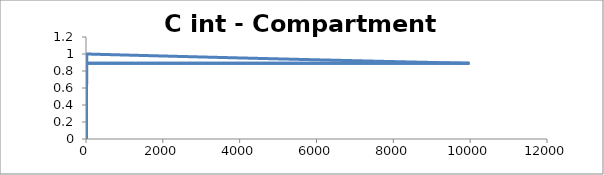
| Category | C - Sys 1 |
|---|---|
| 10.0 | 0 |
| 20.0 | 1 |
| 30.0 | 1 |
| 40.0 | 1 |
| 50.0 | 1 |
| 60.0 | 0.999 |
| 70.0 | 0.999 |
| 80.0 | 0.999 |
| 90.00000000000001 | 0.999 |
| 100.0 | 0.999 |
| 110.0 | 0.999 |
| 120.0 | 0.999 |
| 130.0 | 0.999 |
| 140.0 | 0.998 |
| 150.0 | 0.998 |
| 160.0 | 0.998 |
| 170.0 | 0.998 |
| 180.00000000000003 | 0.998 |
| 190.0 | 0.998 |
| 200.0 | 0.998 |
| 210.0 | 0.998 |
| 220.0 | 0.997 |
| 230.0 | 0.997 |
| 240.0 | 0.997 |
| 250.0 | 0.997 |
| 260.0 | 0.997 |
| 270.0 | 0.997 |
| 280.0 | 0.997 |
| 290.0 | 0.997 |
| 300.0 | 0.997 |
| 310.0 | 0.996 |
| 320.0 | 0.996 |
| 330.0 | 0.996 |
| 340.0 | 0.996 |
| 350.00000000000006 | 0.996 |
| 360.00000000000006 | 0.996 |
| 370.0 | 0.996 |
| 380.0 | 0.996 |
| 390.0 | 0.995 |
| 400.0 | 0.995 |
| 410.0 | 0.995 |
| 420.0 | 0.995 |
| 430.00000000000006 | 0.995 |
| 440.0 | 0.995 |
| 450.0 | 0.995 |
| 460.0 | 0.995 |
| 470.0 | 0.995 |
| 480.0 | 0.994 |
| 490.0 | 0.994 |
| 500.0 | 0.994 |
| 510.00000000000006 | 0.994 |
| 520.0 | 0.994 |
| 530.0 | 0.994 |
| 540.0 | 0.994 |
| 550.0 | 0.994 |
| 560.0 | 0.993 |
| 570.0 | 0.993 |
| 580.0 | 0.993 |
| 590.0 | 0.993 |
| 600.0 | 0.993 |
| 610.0 | 0.993 |
| 620.0 | 0.993 |
| 630.0 | 0.993 |
| 640.0 | 0.992 |
| 650.0 | 0.992 |
| 660.0 | 0.992 |
| 670.0 | 0.992 |
| 680.0 | 0.992 |
| 690.0000000000001 | 0.992 |
| 700.0000000000001 | 0.992 |
| 710.0000000000001 | 0.992 |
| 720.0000000000001 | 0.992 |
| 730.0 | 0.991 |
| 740.0 | 0.991 |
| 750.0 | 0.991 |
| 760.0 | 0.991 |
| 770.0 | 0.991 |
| 780.0 | 0.991 |
| 790.0 | 0.991 |
| 800.0 | 0.991 |
| 810.0 | 0.99 |
| 820.0 | 0.99 |
| 830.0 | 0.99 |
| 840.0 | 0.99 |
| 850.0000000000001 | 0.99 |
| 860.0000000000001 | 0.99 |
| 870.0000000000001 | 0.99 |
| 880.0 | 0.99 |
| 890.0 | 0.99 |
| 900.0 | 0.989 |
| 910.0 | 0.989 |
| 920.0 | 0.989 |
| 930.0 | 0.989 |
| 940.0 | 0.989 |
| 950.0 | 0.989 |
| 960.0 | 0.989 |
| 970.0 | 0.989 |
| 980.0 | 0.988 |
| 990.0 | 0.988 |
| 1000.0 | 0.988 |
| 1010.0000000000001 | 0.988 |
| 1020.0000000000001 | 0.988 |
| 1030.0 | 0.988 |
| 1040.0 | 0.988 |
| 1050.0 | 0.988 |
| 1060.0 | 0.988 |
| 1070.0 | 0.987 |
| 1080.0 | 0.987 |
| 1090.0 | 0.987 |
| 1100.0 | 0.987 |
| 1110.0 | 0.987 |
| 1120.0 | 0.987 |
| 1130.0 | 0.987 |
| 1140.0 | 0.987 |
| 1150.0 | 0.986 |
| 1160.0 | 0.986 |
| 1170.0 | 0.986 |
| 1180.0 | 0.986 |
| 1190.0 | 0.986 |
| 1200.0 | 0.986 |
| 1210.0 | 0.986 |
| 1220.0 | 0.986 |
| 1230.0 | 0.986 |
| 1240.0 | 0.985 |
| 1250.0 | 0.985 |
| 1260.0 | 0.985 |
| 1270.0 | 0.985 |
| 1280.0 | 0.985 |
| 1290.0 | 0.985 |
| 1300.0 | 0.985 |
| 1310.0 | 0.985 |
| 1320.0 | 0.984 |
| 1330.0 | 0.984 |
| 1340.0 | 0.984 |
| 1350.0 | 0.984 |
| 1360.0 | 0.984 |
| 1370.0 | 0.984 |
| 1380.0000000000002 | 0.984 |
| 1390.0000000000002 | 0.984 |
| 1400.0000000000002 | 0.984 |
| 1410.0000000000002 | 0.983 |
| 1420.0000000000002 | 0.983 |
| 1430.0000000000002 | 0.983 |
| 1440.0000000000002 | 0.983 |
| 1450.0 | 0.983 |
| 1460.0 | 0.983 |
| 1470.0 | 0.983 |
| 1480.0 | 0.983 |
| 1490.0 | 0.982 |
| 1500.0 | 0.982 |
| 1510.0 | 0.982 |
| 1520.0 | 0.982 |
| 1530.0 | 0.982 |
| 1540.0 | 0.982 |
| 1550.0 | 0.982 |
| 1560.0 | 0.982 |
| 1570.0 | 0.982 |
| 1580.0 | 0.981 |
| 1590.0 | 0.981 |
| 1600.0 | 0.981 |
| 1610.0 | 0.981 |
| 1620.0 | 0.981 |
| 1630.0 | 0.981 |
| 1640.0 | 0.981 |
| 1650.0 | 0.981 |
| 1660.0 | 0.98 |
| 1670.0 | 0.98 |
| 1680.0 | 0.98 |
| 1690.0 | 0.98 |
| 1700.0000000000002 | 0.98 |
| 1710.0000000000002 | 0.98 |
| 1720.0000000000002 | 0.98 |
| 1730.0000000000002 | 0.98 |
| 1740.0000000000002 | 0.98 |
| 1750.0000000000002 | 0.979 |
| 1760.0 | 0.979 |
| 1770.0 | 0.979 |
| 1780.0 | 0.979 |
| 1790.0 | 0.979 |
| 1800.0 | 0.979 |
| 1810.0 | 0.979 |
| 1820.0 | 0.979 |
| 1830.0 | 0.979 |
| 1840.0 | 0.978 |
| 1850.0 | 0.978 |
| 1860.0 | 0.978 |
| 1870.0 | 0.978 |
| 1880.0 | 0.978 |
| 1890.0 | 0.978 |
| 1900.0 | 0.978 |
| 1910.0 | 0.978 |
| 1920.0 | 0.977 |
| 1930.0 | 0.977 |
| 1940.0 | 0.977 |
| 1950.0 | 0.977 |
| 1960.0 | 0.977 |
| 1970.0 | 0.977 |
| 1980.0 | 0.977 |
| 1990.0 | 0.977 |
| 2000.0 | 0.977 |
| 2010.0000000000002 | 0.976 |
| 2020.0000000000002 | 0.976 |
| 2030.0000000000002 | 0.976 |
| 2040.0000000000002 | 0.976 |
| 2050.0 | 0.976 |
| 2060.0 | 0.976 |
| 2070.0 | 0.976 |
| 2080.0 | 0.976 |
| 2090.0 | 0.976 |
| 2100.0 | 0.975 |
| 2110.0 | 0.975 |
| 2120.0 | 0.975 |
| 2130.0 | 0.975 |
| 2140.0 | 0.975 |
| 2150.0 | 0.975 |
| 2160.0 | 0.975 |
| 2170.0 | 0.975 |
| 2180.0 | 0.974 |
| 2190.0 | 0.974 |
| 2200.0 | 0.974 |
| 2210.0 | 0.974 |
| 2220.0 | 0.974 |
| 2230.0 | 0.974 |
| 2240.0 | 0.974 |
| 2250.0 | 0.974 |
| 2260.0 | 0.974 |
| 2270.0 | 0.973 |
| 2280.0 | 0.973 |
| 2290.0 | 0.973 |
| 2300.0 | 0.973 |
| 2310.0 | 0.973 |
| 2320.0 | 0.973 |
| 2330.0 | 0.973 |
| 2340.0 | 0.973 |
| 2350.0 | 0.973 |
| 2360.0 | 0.972 |
| 2370.0 | 0.972 |
| 2380.0 | 0.972 |
| 2390.0 | 0.972 |
| 2400.0 | 0.972 |
| 2410.0 | 0.972 |
| 2420.0 | 0.972 |
| 2430.0 | 0.972 |
| 2440.0 | 0.971 |
| 2450.0 | 0.971 |
| 2460.0 | 0.971 |
| 2470.0 | 0.971 |
| 2480.0 | 0.971 |
| 2490.0 | 0.971 |
| 2500.0 | 0.971 |
| 2510.0 | 0.971 |
| 2520.0 | 0.971 |
| 2530.0 | 0.97 |
| 2540.0 | 0.97 |
| 2550.0 | 0.97 |
| 2560.0 | 0.97 |
| 2570.0 | 0.97 |
| 2580.0 | 0.97 |
| 2590.0 | 0.97 |
| 2600.0 | 0.97 |
| 2610.0 | 0.97 |
| 2620.0 | 0.969 |
| 2630.0 | 0.969 |
| 2640.0 | 0.969 |
| 2650.0 | 0.969 |
| 2660.0 | 0.969 |
| 2670.0 | 0.969 |
| 2680.0 | 0.969 |
| 2690.0 | 0.969 |
| 2700.0 | 0.968 |
| 2710.0 | 0.968 |
| 2720.0 | 0.968 |
| 2730.0 | 0.968 |
| 2740.0 | 0.968 |
| 2750.0 | 0.968 |
| 2760.0000000000005 | 0.968 |
| 2770.0000000000005 | 0.968 |
| 2780.0000000000005 | 0.968 |
| 2790.0000000000005 | 0.967 |
| 2800.0000000000005 | 0.967 |
| 2810.0000000000005 | 0.967 |
| 2820.0000000000005 | 0.967 |
| 2830.0000000000005 | 0.967 |
| 2840.0000000000005 | 0.967 |
| 2850.0000000000005 | 0.967 |
| 2860.0000000000005 | 0.967 |
| 2870.0000000000005 | 0.967 |
| 2880.0000000000005 | 0.966 |
| 2890.0 | 0.966 |
| 2900.0 | 0.966 |
| 2910.0 | 0.966 |
| 2920.0 | 0.966 |
| 2930.0 | 0.966 |
| 2940.0 | 0.966 |
| 2950.0 | 0.966 |
| 2960.0 | 0.966 |
| 2970.0 | 0.965 |
| 2980.0 | 0.965 |
| 2990.0 | 0.965 |
| 3000.0 | 0.965 |
| 3010.0 | 0.965 |
| 3020.0 | 0.965 |
| 3030.0 | 0.965 |
| 3040.0 | 0.965 |
| 3050.0 | 0.965 |
| 3060.0 | 0.964 |
| 3070.0 | 0.964 |
| 3080.0 | 0.964 |
| 3090.0 | 0.964 |
| 3100.0 | 0.964 |
| 3110.0 | 0.964 |
| 3120.0 | 0.964 |
| 3130.0 | 0.964 |
| 3140.0 | 0.963 |
| 3150.0 | 0.963 |
| 3160.0 | 0.963 |
| 3170.0 | 0.963 |
| 3180.0 | 0.963 |
| 3190.0 | 0.963 |
| 3200.0 | 0.963 |
| 3210.0 | 0.963 |
| 3220.0 | 0.963 |
| 3230.0 | 0.962 |
| 3240.0 | 0.962 |
| 3250.0 | 0.962 |
| 3260.0 | 0.962 |
| 3270.0 | 0.962 |
| 3280.0 | 0.962 |
| 3290.0 | 0.962 |
| 3300.0 | 0.962 |
| 3310.0 | 0.962 |
| 3320.0 | 0.961 |
| 3330.0 | 0.961 |
| 3340.0 | 0.961 |
| 3350.0 | 0.961 |
| 3360.0 | 0.961 |
| 3370.0 | 0.961 |
| 3380.0 | 0.961 |
| 3390.0000000000005 | 0.961 |
| 3400.0000000000005 | 0.961 |
| 3410.0000000000005 | 0.96 |
| 3420.0000000000005 | 0.96 |
| 3430.0000000000005 | 0.96 |
| 3440.0000000000005 | 0.96 |
| 3450.0000000000005 | 0.96 |
| 3460.0000000000005 | 0.96 |
| 3470.0000000000005 | 0.96 |
| 3480.0000000000005 | 0.96 |
| 3490.0000000000005 | 0.96 |
| 3500.0000000000005 | 0.959 |
| 3510.0000000000005 | 0.959 |
| 3520.0 | 0.959 |
| 3530.0 | 0.959 |
| 3540.0 | 0.959 |
| 3550.0 | 0.959 |
| 3560.0 | 0.959 |
| 3570.0 | 0.959 |
| 3580.0 | 0.959 |
| 3590.0 | 0.958 |
| 3600.0 | 0.958 |
| 3610.0 | 0.958 |
| 3620.0 | 0.958 |
| 3630.0 | 0.958 |
| 3640.0 | 0.958 |
| 3650.0 | 0.958 |
| 3660.0 | 0.958 |
| 3670.0 | 0.957 |
| 3680.0 | 0.957 |
| 3690.0 | 0.957 |
| 3700.0 | 0.957 |
| 3710.0 | 0.957 |
| 3720.0 | 0.957 |
| 3730.0 | 0.957 |
| 3740.0 | 0.957 |
| 3750.0 | 0.957 |
| 3760.0 | 0.956 |
| 3770.0 | 0.956 |
| 3780.0 | 0.956 |
| 3790.0 | 0.956 |
| 3800.0 | 0.956 |
| 3810.0 | 0.956 |
| 3820.0 | 0.956 |
| 3830.0 | 0.956 |
| 3840.0 | 0.956 |
| 3850.0 | 0.955 |
| 3860.0 | 0.955 |
| 3870.0 | 0.955 |
| 3880.0 | 0.955 |
| 3890.0 | 0.955 |
| 3900.0 | 0.955 |
| 3910.0 | 0.955 |
| 3920.0 | 0.955 |
| 3930.0 | 0.955 |
| 3940.0 | 0.954 |
| 3950.0 | 0.954 |
| 3960.0 | 0.954 |
| 3970.0 | 0.954 |
| 3980.0 | 0.954 |
| 3990.0 | 0.954 |
| 4000.0 | 0.954 |
| 4010.0000000000005 | 0.954 |
| 4020.0000000000005 | 0.954 |
| 4030.0000000000005 | 0.953 |
| 4040.0000000000005 | 0.953 |
| 4050.0000000000005 | 0.953 |
| 4060.0000000000005 | 0.953 |
| 4070.0000000000005 | 0.953 |
| 4080.0000000000005 | 0.953 |
| 4090.0000000000005 | 0.953 |
| 4100.0 | 0.953 |
| 4110.0 | 0.953 |
| 4120.0 | 0.952 |
| 4130.0 | 0.952 |
| 4140.0 | 0.952 |
| 4150.0 | 0.952 |
| 4160.0 | 0.952 |
| 4170.0 | 0.952 |
| 4180.0 | 0.952 |
| 4190.0 | 0.952 |
| 4200.0 | 0.952 |
| 4210.0 | 0.951 |
| 4220.0 | 0.951 |
| 4230.0 | 0.951 |
| 4240.0 | 0.951 |
| 4250.0 | 0.951 |
| 4260.0 | 0.951 |
| 4270.0 | 0.951 |
| 4280.0 | 0.951 |
| 4290.0 | 0.951 |
| 4300.0 | 0.95 |
| 4310.0 | 0.95 |
| 4320.0 | 0.95 |
| 4330.0 | 0.95 |
| 4340.0 | 0.95 |
| 4350.0 | 0.95 |
| 4360.0 | 0.95 |
| 4370.0 | 0.95 |
| 4380.0 | 0.95 |
| 4390.0 | 0.949 |
| 4400.0 | 0.949 |
| 4410.0 | 0.949 |
| 4420.0 | 0.949 |
| 4430.0 | 0.949 |
| 4440.0 | 0.949 |
| 4450.0 | 0.949 |
| 4460.0 | 0.949 |
| 4470.0 | 0.949 |
| 4480.0 | 0.948 |
| 4490.0 | 0.948 |
| 4500.0 | 0.948 |
| 4510.0 | 0.948 |
| 4520.0 | 0.948 |
| 4530.0 | 0.948 |
| 4540.0 | 0.948 |
| 4550.0 | 0.948 |
| 4560.0 | 0.948 |
| 4570.0 | 0.947 |
| 4580.0 | 0.947 |
| 4590.0 | 0.947 |
| 4600.0 | 0.947 |
| 4610.0 | 0.947 |
| 4620.0 | 0.947 |
| 4630.0 | 0.947 |
| 4640.0 | 0.947 |
| 4650.0 | 0.947 |
| 4660.0 | 0.946 |
| 4670.0 | 0.946 |
| 4680.0 | 0.946 |
| 4690.0 | 0.946 |
| 4700.0 | 0.946 |
| 4710.0 | 0.946 |
| 4720.0 | 0.946 |
| 4730.0 | 0.946 |
| 4740.0 | 0.946 |
| 4750.0 | 0.945 |
| 4760.0 | 0.945 |
| 4770.0 | 0.945 |
| 4780.0 | 0.945 |
| 4790.0 | 0.945 |
| 4800.0 | 0.945 |
| 4810.0 | 0.945 |
| 4820.0 | 0.945 |
| 4830.0 | 0.945 |
| 4840.0 | 0.944 |
| 4850.0 | 0.944 |
| 4860.0 | 0.944 |
| 4870.0 | 0.944 |
| 4880.0 | 0.944 |
| 4890.0 | 0.944 |
| 4900.0 | 0.944 |
| 4910.0 | 0.944 |
| 4920.0 | 0.944 |
| 4930.0 | 0.943 |
| 4940.0 | 0.943 |
| 4950.0 | 0.943 |
| 4960.0 | 0.943 |
| 4970.0 | 0.943 |
| 4980.0 | 0.943 |
| 4990.0 | 0.943 |
| 5000.0 | 0.943 |
| 5010.0 | 0.943 |
| 5020.0 | 0.943 |
| 5030.0 | 0.942 |
| 5040.0 | 0.942 |
| 5050.0 | 0.942 |
| 5060.0 | 0.942 |
| 5070.0 | 0.942 |
| 5080.0 | 0.942 |
| 5090.0 | 0.942 |
| 5100.0 | 0.942 |
| 5110.0 | 0.942 |
| 5120.0 | 0.941 |
| 5130.0 | 0.941 |
| 5140.0 | 0.941 |
| 5150.0 | 0.941 |
| 5160.0 | 0.941 |
| 5170.0 | 0.941 |
| 5180.0 | 0.941 |
| 5190.0 | 0.941 |
| 5200.0 | 0.941 |
| 5210.0 | 0.94 |
| 5220.0 | 0.94 |
| 5230.0 | 0.94 |
| 5240.0 | 0.94 |
| 5250.0 | 0.94 |
| 5260.0 | 0.94 |
| 5270.0 | 0.94 |
| 5280.0 | 0.94 |
| 5290.0 | 0.94 |
| 5300.0 | 0.939 |
| 5310.0 | 0.939 |
| 5320.0 | 0.939 |
| 5330.0 | 0.939 |
| 5340.0 | 0.939 |
| 5350.0 | 0.939 |
| 5360.0 | 0.939 |
| 5370.0 | 0.939 |
| 5380.0 | 0.939 |
| 5390.0 | 0.938 |
| 5400.0 | 0.938 |
| 5410.0 | 0.938 |
| 5420.0 | 0.938 |
| 5430.0 | 0.938 |
| 5440.0 | 0.938 |
| 5450.0 | 0.938 |
| 5460.0 | 0.938 |
| 5470.0 | 0.938 |
| 5480.0 | 0.937 |
| 5490.0 | 0.937 |
| 5500.0 | 0.937 |
| 5510.0 | 0.937 |
| 5520.000000000001 | 0.937 |
| 5530.000000000001 | 0.937 |
| 5540.000000000001 | 0.937 |
| 5550.000000000001 | 0.937 |
| 5560.000000000001 | 0.937 |
| 5570.000000000001 | 0.937 |
| 5580.000000000001 | 0.936 |
| 5590.000000000001 | 0.936 |
| 5600.000000000001 | 0.936 |
| 5610.000000000001 | 0.936 |
| 5620.000000000001 | 0.936 |
| 5630.000000000001 | 0.936 |
| 5640.000000000001 | 0.936 |
| 5650.000000000001 | 0.936 |
| 5660.000000000001 | 0.936 |
| 5670.000000000001 | 0.935 |
| 5680.000000000001 | 0.935 |
| 5690.000000000001 | 0.935 |
| 5700.000000000001 | 0.935 |
| 5710.000000000001 | 0.935 |
| 5720.000000000001 | 0.935 |
| 5730.000000000001 | 0.935 |
| 5740.000000000001 | 0.935 |
| 5750.000000000001 | 0.935 |
| 5760.000000000001 | 0.934 |
| 5770.0 | 0.934 |
| 5780.0 | 0.934 |
| 5790.0 | 0.934 |
| 5800.0 | 0.934 |
| 5810.0 | 0.934 |
| 5820.0 | 0.934 |
| 5830.0 | 0.934 |
| 5840.0 | 0.934 |
| 5850.0 | 0.933 |
| 5860.0 | 0.933 |
| 5870.0 | 0.933 |
| 5880.0 | 0.933 |
| 5890.0 | 0.933 |
| 5900.0 | 0.933 |
| 5910.0 | 0.933 |
| 5920.0 | 0.933 |
| 5930.0 | 0.933 |
| 5940.0 | 0.933 |
| 5950.0 | 0.932 |
| 5960.0 | 0.932 |
| 5970.0 | 0.932 |
| 5980.0 | 0.932 |
| 5990.0 | 0.932 |
| 6000.0 | 0.932 |
| 6010.0 | 0.932 |
| 6020.0 | 0.932 |
| 6030.0 | 0.932 |
| 6040.0 | 0.931 |
| 6050.0 | 0.931 |
| 6060.0 | 0.931 |
| 6070.0 | 0.931 |
| 6080.0 | 0.931 |
| 6090.0 | 0.931 |
| 6100.0 | 0.931 |
| 6110.0 | 0.931 |
| 6120.0 | 0.931 |
| 6130.0 | 0.93 |
| 6140.0 | 0.93 |
| 6150.0 | 0.93 |
| 6160.0 | 0.93 |
| 6170.0 | 0.93 |
| 6180.0 | 0.93 |
| 6190.0 | 0.93 |
| 6200.0 | 0.93 |
| 6210.0 | 0.93 |
| 6220.0 | 0.929 |
| 6230.0 | 0.929 |
| 6240.0 | 0.929 |
| 6250.0 | 0.929 |
| 6260.0 | 0.929 |
| 6270.0 | 0.929 |
| 6280.0 | 0.929 |
| 6290.0 | 0.929 |
| 6300.0 | 0.929 |
| 6310.0 | 0.929 |
| 6320.0 | 0.928 |
| 6330.0 | 0.928 |
| 6340.0 | 0.928 |
| 6350.0 | 0.928 |
| 6360.0 | 0.928 |
| 6370.0 | 0.928 |
| 6380.0 | 0.928 |
| 6390.0 | 0.928 |
| 6400.0 | 0.928 |
| 6410.0 | 0.927 |
| 6420.0 | 0.927 |
| 6430.0 | 0.927 |
| 6440.0 | 0.927 |
| 6450.0 | 0.927 |
| 6460.0 | 0.927 |
| 6470.0 | 0.927 |
| 6480.0 | 0.927 |
| 6490.0 | 0.927 |
| 6500.0 | 0.926 |
| 6510.0 | 0.926 |
| 6520.0 | 0.926 |
| 6530.0 | 0.926 |
| 6540.0 | 0.926 |
| 6550.0 | 0.926 |
| 6560.0 | 0.926 |
| 6570.0 | 0.926 |
| 6580.0 | 0.926 |
| 6590.0 | 0.926 |
| 6600.0 | 0.925 |
| 6610.0 | 0.925 |
| 6620.0 | 0.925 |
| 6630.0 | 0.925 |
| 6640.0 | 0.925 |
| 6650.0 | 0.925 |
| 6660.0 | 0.925 |
| 6670.0 | 0.925 |
| 6680.0 | 0.925 |
| 6690.0 | 0.924 |
| 6700.0 | 0.924 |
| 6710.0 | 0.924 |
| 6720.0 | 0.924 |
| 6730.0 | 0.924 |
| 6740.0 | 0.924 |
| 6750.0 | 0.924 |
| 6760.0 | 0.924 |
| 6770.000000000001 | 0.924 |
| 6780.000000000001 | 0.924 |
| 6790.000000000001 | 0.923 |
| 6800.000000000001 | 0.923 |
| 6810.000000000001 | 0.923 |
| 6820.000000000001 | 0.923 |
| 6830.000000000001 | 0.923 |
| 6840.000000000001 | 0.923 |
| 6850.000000000001 | 0.923 |
| 6860.000000000001 | 0.923 |
| 6870.000000000001 | 0.923 |
| 6880.000000000001 | 0.922 |
| 6890.000000000001 | 0.922 |
| 6900.000000000001 | 0.922 |
| 6910.000000000001 | 0.922 |
| 6920.000000000001 | 0.922 |
| 6930.000000000001 | 0.922 |
| 6940.000000000001 | 0.922 |
| 6950.000000000001 | 0.922 |
| 6960.000000000001 | 0.922 |
| 6970.000000000001 | 0.921 |
| 6980.000000000001 | 0.921 |
| 6990.000000000001 | 0.921 |
| 7000.000000000001 | 0.921 |
| 7010.000000000001 | 0.921 |
| 7020.000000000001 | 0.921 |
| 7030.000000000001 | 0.921 |
| 7040.0 | 0.921 |
| 7050.0 | 0.921 |
| 7060.0 | 0.921 |
| 7070.0 | 0.92 |
| 7080.0 | 0.92 |
| 7090.0 | 0.92 |
| 7100.0 | 0.92 |
| 7110.0 | 0.92 |
| 7120.0 | 0.92 |
| 7130.0 | 0.92 |
| 7140.0 | 0.92 |
| 7150.0 | 0.92 |
| 7160.0 | 0.919 |
| 7170.0 | 0.919 |
| 7180.0 | 0.919 |
| 7190.0 | 0.919 |
| 7200.0 | 0.919 |
| 7210.0 | 0.919 |
| 7220.0 | 0.919 |
| 7230.0 | 0.919 |
| 7240.0 | 0.919 |
| 7250.0 | 0.919 |
| 7260.0 | 0.918 |
| 7270.0 | 0.918 |
| 7280.0 | 0.918 |
| 7290.0 | 0.918 |
| 7300.0 | 0.918 |
| 7310.0 | 0.918 |
| 7320.0 | 0.918 |
| 7330.0 | 0.918 |
| 7340.0 | 0.918 |
| 7350.0 | 0.917 |
| 7360.0 | 0.917 |
| 7370.0 | 0.917 |
| 7380.0 | 0.917 |
| 7390.0 | 0.917 |
| 7400.0 | 0.917 |
| 7410.0 | 0.917 |
| 7420.0 | 0.917 |
| 7430.0 | 0.917 |
| 7440.0 | 0.917 |
| 7450.0 | 0.916 |
| 7460.0 | 0.916 |
| 7470.0 | 0.916 |
| 7480.0 | 0.916 |
| 7490.0 | 0.916 |
| 7500.0 | 0.916 |
| 7510.0 | 0.916 |
| 7520.0 | 0.916 |
| 7530.0 | 0.916 |
| 7540.0 | 0.915 |
| 7550.0 | 0.915 |
| 7560.0 | 0.915 |
| 7570.0 | 0.915 |
| 7580.0 | 0.915 |
| 7590.0 | 0.915 |
| 7600.0 | 0.915 |
| 7610.0 | 0.915 |
| 7620.0 | 0.915 |
| 7630.0 | 0.915 |
| 7640.0 | 0.914 |
| 7650.0 | 0.914 |
| 7660.0 | 0.914 |
| 7670.0 | 0.914 |
| 7680.0 | 0.914 |
| 7690.0 | 0.914 |
| 7700.0 | 0.914 |
| 7710.0 | 0.914 |
| 7720.0 | 0.914 |
| 7730.0 | 0.914 |
| 7740.0 | 0.913 |
| 7750.0 | 0.913 |
| 7760.0 | 0.913 |
| 7770.0 | 0.913 |
| 7780.0 | 0.913 |
| 7790.0 | 0.913 |
| 7800.0 | 0.913 |
| 7810.0 | 0.913 |
| 7820.0 | 0.913 |
| 7830.0 | 0.912 |
| 7840.0 | 0.912 |
| 7850.0 | 0.912 |
| 7860.0 | 0.912 |
| 7870.0 | 0.912 |
| 7880.0 | 0.912 |
| 7890.0 | 0.912 |
| 7900.0 | 0.912 |
| 7910.0 | 0.912 |
| 7920.0 | 0.912 |
| 7930.0 | 0.911 |
| 7940.0 | 0.911 |
| 7950.0 | 0.911 |
| 7960.0 | 0.911 |
| 7970.0 | 0.911 |
| 7980.0 | 0.911 |
| 7990.0 | 0.911 |
| 8000.0 | 0.911 |
| 8010.0 | 0.911 |
| 8020.000000000001 | 0.91 |
| 8030.000000000001 | 0.91 |
| 8040.000000000001 | 0.91 |
| 8050.000000000001 | 0.91 |
| 8060.000000000001 | 0.91 |
| 8070.000000000001 | 0.91 |
| 8080.000000000001 | 0.91 |
| 8090.000000000001 | 0.91 |
| 8100.000000000001 | 0.91 |
| 8110.000000000001 | 0.91 |
| 8120.000000000001 | 0.909 |
| 8130.000000000001 | 0.909 |
| 8140.000000000001 | 0.909 |
| 8150.000000000001 | 0.909 |
| 8160.000000000001 | 0.909 |
| 8170.000000000001 | 0.909 |
| 8180.000000000001 | 0.909 |
| 8190.000000000001 | 0.909 |
| 8200.0 | 0.909 |
| 8210.0 | 0.909 |
| 8220.0 | 0.908 |
| 8230.0 | 0.908 |
| 8240.0 | 0.908 |
| 8250.0 | 0.908 |
| 8260.0 | 0.908 |
| 8270.0 | 0.908 |
| 8280.0 | 0.908 |
| 8290.0 | 0.908 |
| 8300.0 | 0.908 |
| 8310.0 | 0.907 |
| 8320.0 | 0.907 |
| 8330.0 | 0.907 |
| 8340.0 | 0.907 |
| 8350.0 | 0.907 |
| 8360.0 | 0.907 |
| 8370.0 | 0.907 |
| 8380.0 | 0.907 |
| 8390.0 | 0.907 |
| 8400.0 | 0.907 |
| 8410.0 | 0.906 |
| 8420.0 | 0.906 |
| 8430.0 | 0.906 |
| 8440.0 | 0.906 |
| 8450.0 | 0.906 |
| 8460.0 | 0.906 |
| 8470.0 | 0.906 |
| 8480.0 | 0.906 |
| 8490.0 | 0.906 |
| 8500.0 | 0.906 |
| 8510.0 | 0.905 |
| 8520.0 | 0.905 |
| 8530.0 | 0.905 |
| 8540.0 | 0.905 |
| 8550.0 | 0.905 |
| 8560.0 | 0.905 |
| 8570.0 | 0.905 |
| 8580.0 | 0.905 |
| 8590.0 | 0.905 |
| 8600.0 | 0.904 |
| 8610.0 | 0.904 |
| 8620.0 | 0.904 |
| 8630.0 | 0.904 |
| 8640.0 | 0.904 |
| 8650.0 | 0.904 |
| 8660.0 | 0.904 |
| 8670.0 | 0.904 |
| 8680.0 | 0.904 |
| 8690.0 | 0.904 |
| 8700.0 | 0.903 |
| 8710.0 | 0.903 |
| 8720.0 | 0.903 |
| 8730.0 | 0.903 |
| 8740.0 | 0.903 |
| 8750.0 | 0.903 |
| 8760.0 | 0.903 |
| 8770.0 | 0.903 |
| 8780.0 | 0.903 |
| 8790.0 | 0.903 |
| 8800.0 | 0.902 |
| 8810.0 | 0.902 |
| 8820.0 | 0.902 |
| 8830.0 | 0.902 |
| 8840.0 | 0.902 |
| 8850.0 | 0.902 |
| 8860.0 | 0.902 |
| 8870.0 | 0.902 |
| 8880.0 | 0.902 |
| 8890.0 | 0.902 |
| 8900.0 | 0.901 |
| 8910.0 | 0.901 |
| 8920.0 | 0.901 |
| 8930.0 | 0.901 |
| 8940.0 | 0.901 |
| 8950.0 | 0.901 |
| 8960.0 | 0.901 |
| 8970.0 | 0.901 |
| 8980.0 | 0.901 |
| 8990.0 | 0.9 |
| 9000.0 | 0.9 |
| 9010.0 | 0.9 |
| 9020.0 | 0.9 |
| 9030.0 | 0.9 |
| 9040.0 | 0.9 |
| 9050.0 | 0.9 |
| 9060.0 | 0.9 |
| 9070.0 | 0.9 |
| 9080.0 | 0.9 |
| 9090.0 | 0.899 |
| 9100.0 | 0.899 |
| 9110.0 | 0.899 |
| 9120.0 | 0.899 |
| 9130.0 | 0.899 |
| 9140.0 | 0.899 |
| 9150.0 | 0.899 |
| 9160.0 | 0.899 |
| 9170.0 | 0.899 |
| 9180.0 | 0.899 |
| 9190.0 | 0.898 |
| 9200.0 | 0.898 |
| 9210.0 | 0.898 |
| 9220.0 | 0.898 |
| 9230.0 | 0.898 |
| 9240.0 | 0.898 |
| 9250.0 | 0.898 |
| 9260.0 | 0.898 |
| 9270.0 | 0.898 |
| 9280.0 | 0.898 |
| 9290.0 | 0.897 |
| 9300.0 | 0.897 |
| 9310.0 | 0.897 |
| 9320.0 | 0.897 |
| 9330.0 | 0.897 |
| 9340.0 | 0.897 |
| 9350.0 | 0.897 |
| 9360.0 | 0.897 |
| 9370.0 | 0.897 |
| 9380.0 | 0.897 |
| 9390.0 | 0.896 |
| 9400.0 | 0.896 |
| 9410.0 | 0.896 |
| 9420.0 | 0.896 |
| 9430.0 | 0.896 |
| 9440.0 | 0.896 |
| 9450.0 | 0.896 |
| 9460.0 | 0.896 |
| 9470.0 | 0.896 |
| 9480.0 | 0.896 |
| 9490.0 | 0.895 |
| 9500.0 | 0.895 |
| 9510.0 | 0.895 |
| 9520.0 | 0.895 |
| 9530.0 | 0.895 |
| 9540.0 | 0.895 |
| 9550.0 | 0.895 |
| 9560.0 | 0.895 |
| 9570.0 | 0.895 |
| 9580.0 | 0.895 |
| 9590.0 | 0.894 |
| 9600.0 | 0.894 |
| 9610.0 | 0.894 |
| 9620.0 | 0.894 |
| 9630.0 | 0.894 |
| 9640.0 | 0.894 |
| 9650.0 | 0.894 |
| 9660.0 | 0.894 |
| 9670.0 | 0.894 |
| 9680.0 | 0.893 |
| 9690.0 | 0.893 |
| 9700.0 | 0.893 |
| 9710.0 | 0.893 |
| 9720.0 | 0.893 |
| 9730.0 | 0.893 |
| 9740.0 | 0.893 |
| 9750.0 | 0.893 |
| 9760.0 | 0.893 |
| 9770.0 | 0.893 |
| 9780.0 | 0.892 |
| 9790.0 | 0.892 |
| 9800.0 | 0.892 |
| 9810.0 | 0.892 |
| 9820.0 | 0.892 |
| 9830.0 | 0.892 |
| 9840.0 | 0.892 |
| 9850.0 | 0.892 |
| 9860.0 | 0.892 |
| 9870.0 | 0.892 |
| 9880.0 | 0.891 |
| 9890.0 | 0.891 |
| 9900.0 | 0.891 |
| 9910.0 | 0.891 |
| 9920.0 | 0.891 |
| 9930.0 | 0.891 |
| 9940.0 | 0.891 |
| 9950.0 | 0.891 |
| 9960.0 | 0.891 |
| 9970.0 | 0.891 |
| 9980.0 | 0.89 |
| 9990.0 | 0.89 |
| 10000.0 | 0.89 |